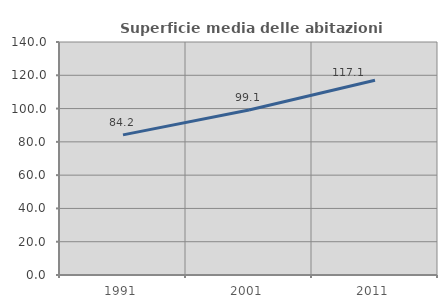
| Category | Superficie media delle abitazioni occupate |
|---|---|
| 1991.0 | 84.211 |
| 2001.0 | 99.102 |
| 2011.0 | 117.067 |